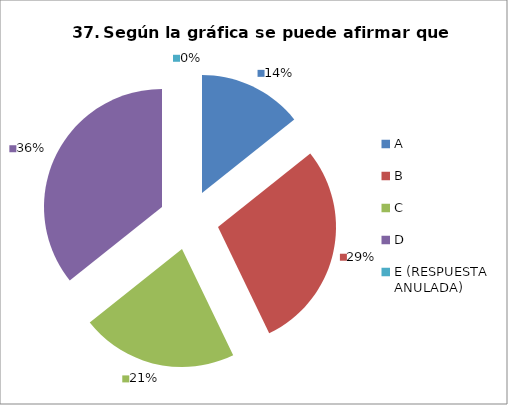
| Category | CANTIDAD DE RESPUESTAS PREGUNTA (37) | PORCENTAJE |
|---|---|---|
| A | 4 | 0.143 |
| B | 8 | 0.286 |
| C | 6 | 0.214 |
| D | 10 | 0.357 |
| E (RESPUESTA ANULADA) | 0 | 0 |